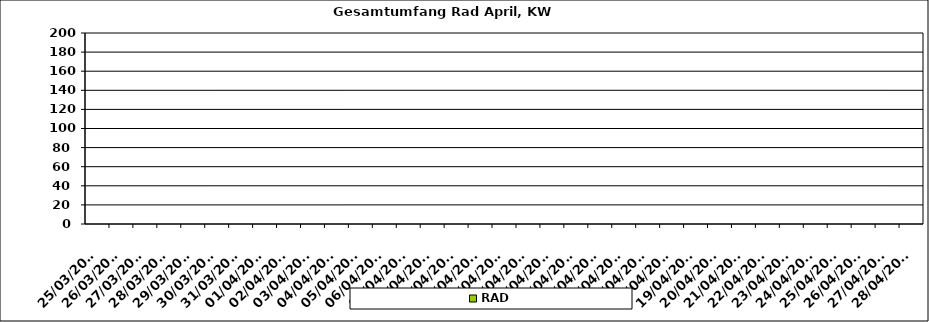
| Category | RAD |
|---|---|
| 27/03/2023 | 0 |
| 28/03/2023 | 0 |
| 29/03/2023 | 0 |
| 30/03/2023 | 0 |
| 31/03/2023 | 0 |
| 01/04/2023 | 0 |
| 02/04/2023 | 0 |
| 03/04/2023 | 0 |
| 04/04/2023 | 0 |
| 05/04/2023 | 0 |
| 06/04/2023 | 0 |
| 07/04/2023 | 0 |
| 08/04/2023 | 0 |
| 09/04/2023 | 0 |
| 10/04/2023 | 0 |
| 11/04/2023 | 0 |
| 12/04/2023 | 0 |
| 13/04/2023 | 0 |
| 14/04/2023 | 0 |
| 15/04/2023 | 0 |
| 16/04/2023 | 0 |
| 17/04/2023 | 0 |
| 18/04/2023 | 0 |
| 19/04/2023 | 0 |
| 20/04/2023 | 0 |
| 21/04/2023 | 0 |
| 22/04/2023 | 0 |
| 23/04/2023 | 0 |